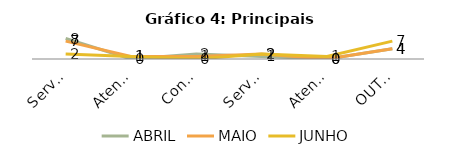
| Category | ABRIL | MAIO | JUNHO |
|---|---|---|---|
| Servidor Público | 8 | 7 | 2 |
| Atendimento ao cidadão em órgão, entidade pública do DF | 0 | 1 | 1 |
| Conduta de servidor do DETRAN-DF | 2 | 1 | 0 |
| Serviço prestado por órgão, entidade do GDF | 1 | 2 | 2 |
| Atendimento presencial | 0 | 0 | 1 |
| OUTROS | 4 | 4 | 7 |